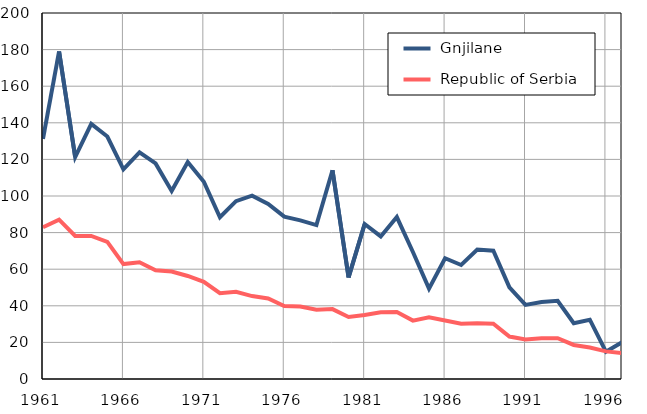
| Category |  Gnjilane |  Republic of Serbia |
|---|---|---|
| 1961.0 | 131.2 | 82.9 |
| 1962.0 | 179 | 87.1 |
| 1963.0 | 121.3 | 78.2 |
| 1964.0 | 139.4 | 78.2 |
| 1965.0 | 132.5 | 74.9 |
| 1966.0 | 114.6 | 62.8 |
| 1967.0 | 123.8 | 63.8 |
| 1968.0 | 117.8 | 59.4 |
| 1969.0 | 102.7 | 58.7 |
| 1970.0 | 118.6 | 56.3 |
| 1971.0 | 107.8 | 53.1 |
| 1972.0 | 88.4 | 46.9 |
| 1973.0 | 97.2 | 47.7 |
| 1974.0 | 100.2 | 45.3 |
| 1975.0 | 95.7 | 44 |
| 1976.0 | 88.7 | 39.9 |
| 1977.0 | 86.7 | 39.6 |
| 1978.0 | 84.1 | 37.8 |
| 1979.0 | 114.1 | 38.2 |
| 1980.0 | 55.5 | 33.9 |
| 1981.0 | 84.7 | 35 |
| 1982.0 | 77.9 | 36.5 |
| 1983.0 | 88.5 | 36.6 |
| 1984.0 | 69.4 | 31.9 |
| 1985.0 | 49.4 | 33.7 |
| 1986.0 | 66 | 32 |
| 1987.0 | 62.3 | 30.2 |
| 1988.0 | 70.7 | 30.5 |
| 1989.0 | 70.1 | 30.2 |
| 1990.0 | 50.1 | 23.2 |
| 1991.0 | 40.5 | 21.6 |
| 1992.0 | 42.1 | 22.3 |
| 1993.0 | 42.7 | 22.3 |
| 1994.0 | 30.5 | 18.6 |
| 1995.0 | 32.4 | 17.2 |
| 1996.0 | 14.9 | 15.1 |
| 1997.0 | 20.1 | 14.2 |